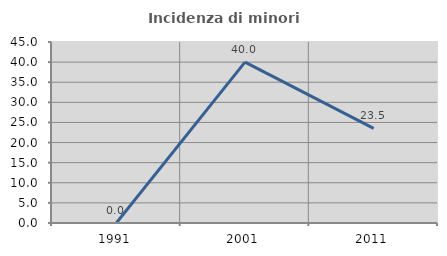
| Category | Incidenza di minori stranieri |
|---|---|
| 1991.0 | 0 |
| 2001.0 | 40 |
| 2011.0 | 23.529 |